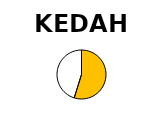
| Category | Series 1 | Series 0 |
|---|---|---|
| Operational Capacity (MW) | 194.99 | 33.996 |
| In progress (MW) | 160.78 | 0 |